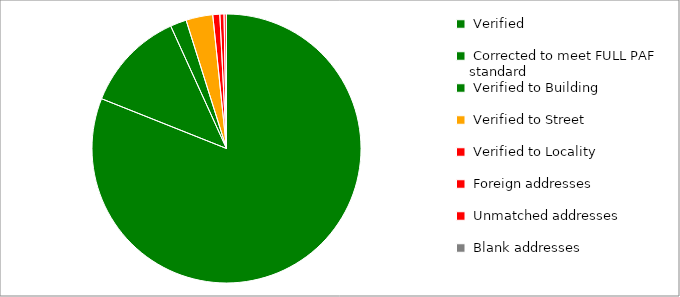
| Category | Series 0 |
|---|---|
|  Verified  | 61844 |
|  Corrected to meet FULL PAF standard  | 9284 |
|  Verified to Building  | 1488 |
|  Verified to Street  | 2457 |
|  Verified to Locality  | 642 |
|  Foreign addresses  | 381 |
|  Unmatched addresses  | 208 |
|  Blank addresses  | 16 |